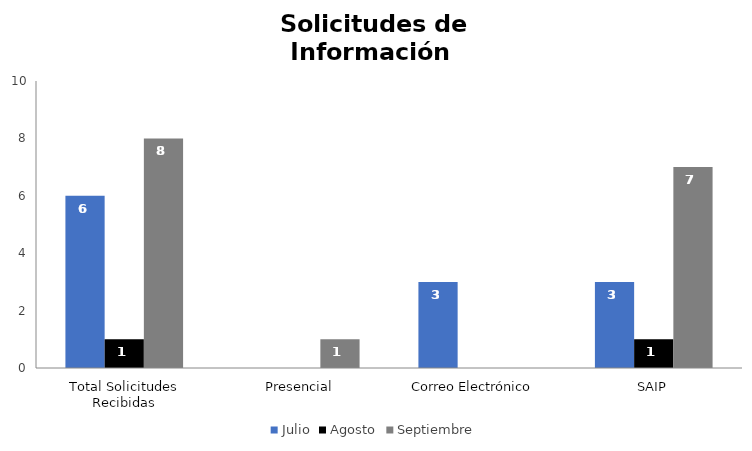
| Category | Julio | Agosto | Septiembre |
|---|---|---|---|
| Total Solicitudes Recibidas | 6 | 1 | 8 |
| Presencial | 0 | 0 | 1 |
| Correo Electrónico  | 3 | 0 | 0 |
| SAIP | 3 | 1 | 7 |